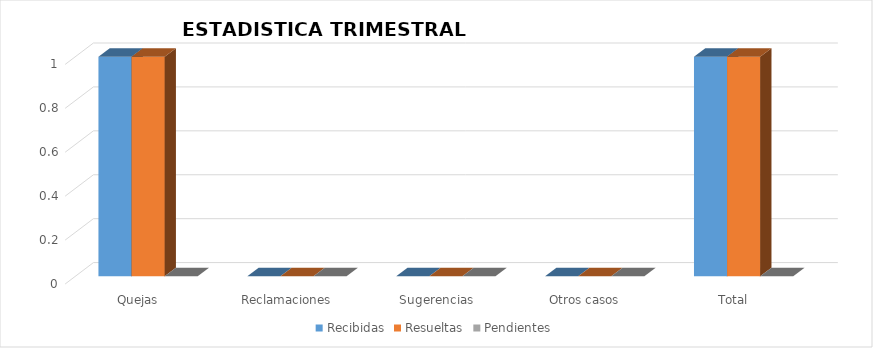
| Category | Recibidas | Resueltas | Pendientes |
|---|---|---|---|
| Quejas | 1 | 1 | 0 |
| Reclamaciones | 0 | 0 | 0 |
| Sugerencias | 0 | 0 | 0 |
| Otros casos | 0 | 0 | 0 |
| Total | 1 | 1 | 0 |